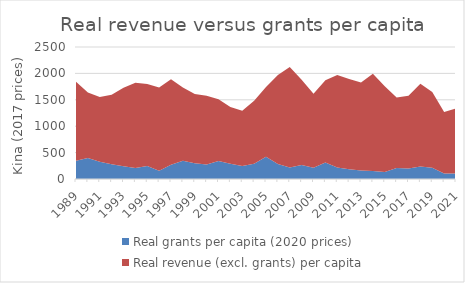
| Category | Real grants per capita (2020 prices) | Real revenue (excl. grants) per capita |
|---|---|---|
| 1989.0 | 344.657 | 1497.452 |
| 1990.0 | 396.757 | 1243.514 |
| 1991.0 | 325.35 | 1228.998 |
| 1992.0 | 278.52 | 1318.395 |
| 1993.0 | 239.858 | 1488.679 |
| 1994.0 | 206.759 | 1614.553 |
| 1995.0 | 247.282 | 1551.286 |
| 1996.0 | 155.378 | 1578.078 |
| 1997.0 | 267.521 | 1620.388 |
| 1998.0 | 346.414 | 1386.687 |
| 1999.0 | 298.577 | 1309.144 |
| 2000.0 | 273.286 | 1301.549 |
| 2001.0 | 340.761 | 1168.634 |
| 2002.0 | 287.146 | 1077.733 |
| 2003.0 | 245.856 | 1049.092 |
| 2004.0 | 289.114 | 1190.855 |
| 2005.0 | 419.478 | 1321.988 |
| 2006.0 | 285.405 | 1684.156 |
| 2007.0 | 217.667 | 1904.241 |
| 2008.0 | 266.452 | 1614.481 |
| 2009.0 | 213.107 | 1402.21 |
| 2010.0 | 314.152 | 1555.471 |
| 2011.0 | 216.837 | 1751.598 |
| 2012.0 | 184.443 | 1711.113 |
| 2013.0 | 163.283 | 1666.358 |
| 2014.0 | 150.354 | 1842.391 |
| 2015.0 | 131.333 | 1625.679 |
| 2016.0 | 210.538 | 1333.13 |
| 2017.0 | 197.158 | 1380.911 |
| 2018.0 | 235.375 | 1570.627 |
| 2019.0 | 213.854 | 1433.834 |
| 2020.0 | 104.126 | 1164.816 |
| 2021.0 | 103.496 | 1230.362 |